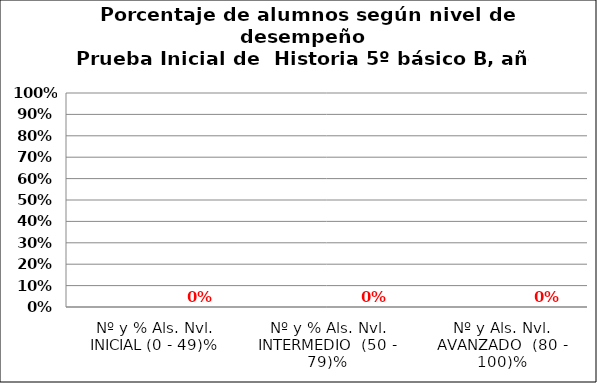
| Category | Series 0 | Series 1 | Series 2 | Series 3 |
|---|---|---|---|---|
| Nº y % Als. Nvl. INICIAL (0 - 49)% |  |  |  | 0 |
| Nº y % Als. Nvl. INTERMEDIO  (50 - 79)% |  |  |  | 0 |
| Nº y Als. Nvl. AVANZADO  (80 - 100)% |  |  |  | 0 |